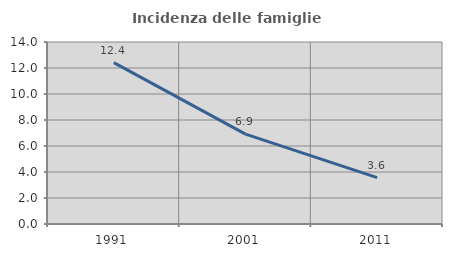
| Category | Incidenza delle famiglie numerose |
|---|---|
| 1991.0 | 12.411 |
| 2001.0 | 6.912 |
| 2011.0 | 3.571 |